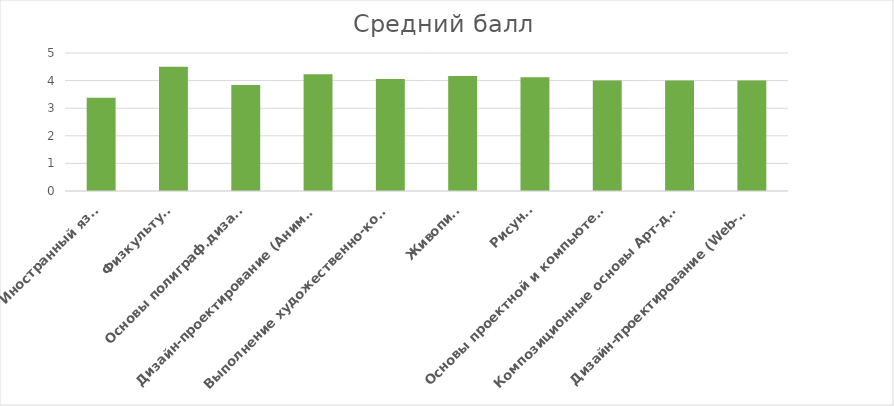
| Category | Средний балл |
|---|---|
| Иностранный язык | 3.38 |
| Физкультура | 4.5 |
| Основы полиграф.дизайна | 3.84 |
| Дизайн-проектирование (Анимация) | 4.23 |
| Выполнение художественно-конструкторских работ в материале | 4.06 |
| Живопись | 4.17 |
| Рисунок | 4.12 |
| Основы проектной и компьютерной графики | 4 |
| Композиционные основы Арт-дизайна | 4 |
| Дизайн-проектирование (Web-дизайн) | 4 |